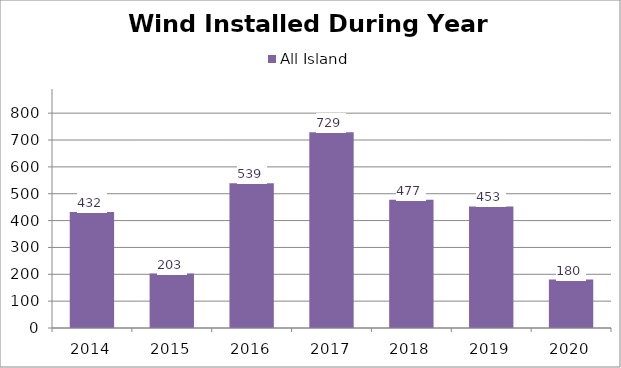
| Category | All Island |
|---|---|
| 2014.0 | 432.321 |
| 2015.0 | 202.74 |
| 2016.0 | 539.087 |
| 2017.0 | 728.603 |
| 2018.0 | 477.31 |
| 2019.0 | 452.605 |
| 2020.0 | 180.198 |